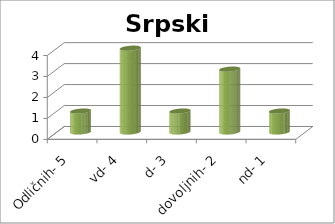
| Category | Series 0 |
|---|---|
| Odličnih- 5 | 1 |
| vd- 4 | 4 |
| d- 3 | 1 |
| dovoljnih- 2 | 3 |
| nd- 1 | 1 |